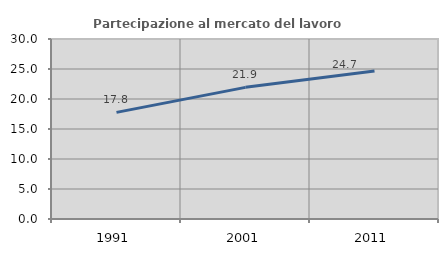
| Category | Partecipazione al mercato del lavoro  femminile |
|---|---|
| 1991.0 | 17.768 |
| 2001.0 | 21.94 |
| 2011.0 | 24.66 |